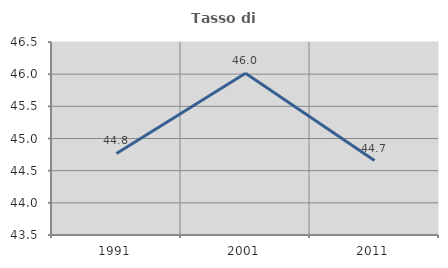
| Category | Tasso di occupazione   |
|---|---|
| 1991.0 | 44.768 |
| 2001.0 | 46.014 |
| 2011.0 | 44.657 |